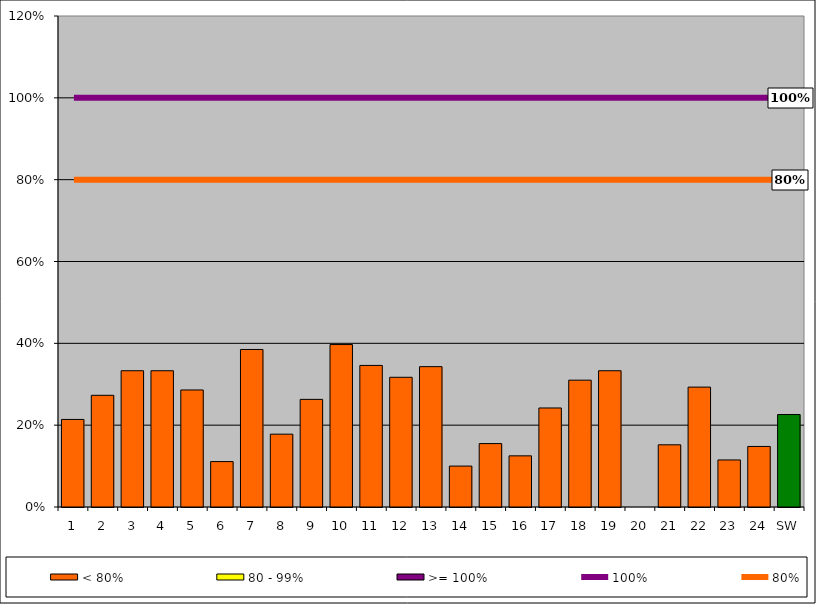
| Category | < 80% | 80 - 99% | >= 100% |
|---|---|---|---|
| 1 | 0.214 | 0 | 0 |
| 2 | 0.273 | 0 | 0 |
| 3 | 0.333 | 0 | 0 |
| 4 | 0.333 | 0 | 0 |
| 5 | 0.286 | 0 | 0 |
| 6 | 0.111 | 0 | 0 |
| 7 | 0.385 | 0 | 0 |
| 8 | 0.178 | 0 | 0 |
| 9 | 0.263 | 0 | 0 |
| 10 | 0.397 | 0 | 0 |
| 11 | 0.346 | 0 | 0 |
| 12 | 0.317 | 0 | 0 |
| 13 | 0.343 | 0 | 0 |
| 14 | 0.1 | 0 | 0 |
| 15 | 0.155 | 0 | 0 |
| 16 | 0.125 | 0 | 0 |
| 17 | 0.242 | 0 | 0 |
| 18 | 0.31 | 0 | 0 |
| 19 | 0.333 | 0 | 0 |
| 20 | 0 | 0 | 0 |
| 21 | 0.152 | 0 | 0 |
| 22 | 0.293 | 0 | 0 |
| 23 | 0.115 | 0 | 0 |
| 24 | 0.148 | 0 | 0 |
| SW | 0.226 | 0 | 0 |